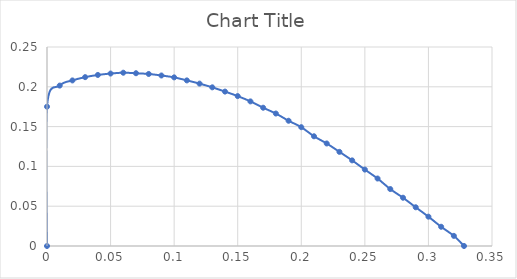
| Category | Series 0 |
|---|---|
| 0.0 | 0 |
| 0.0 | 0.175 |
| 0.01 | 0.202 |
| 0.02 | 0.208 |
| 0.03 | 0.212 |
| 0.04 | 0.215 |
| 0.05 | 0.217 |
| 0.06 | 0.218 |
| 0.07 | 0.217 |
| 0.08 | 0.216 |
| 0.09 | 0.214 |
| 0.1 | 0.212 |
| 0.11 | 0.208 |
| 0.12 | 0.204 |
| 0.13 | 0.199 |
| 0.14 | 0.194 |
| 0.15 | 0.188 |
| 0.16 | 0.182 |
| 0.17 | 0.174 |
| 0.18 | 0.166 |
| 0.19 | 0.157 |
| 0.2 | 0.149 |
| 0.21 | 0.138 |
| 0.22 | 0.129 |
| 0.23 | 0.118 |
| 0.24 | 0.108 |
| 0.25 | 0.096 |
| 0.26 | 0.085 |
| 0.27 | 0.072 |
| 0.28 | 0.061 |
| 0.29 | 0.049 |
| 0.3 | 0.037 |
| 0.31 | 0.024 |
| 0.32 | 0.013 |
| 0.32799999999999996 | 0 |